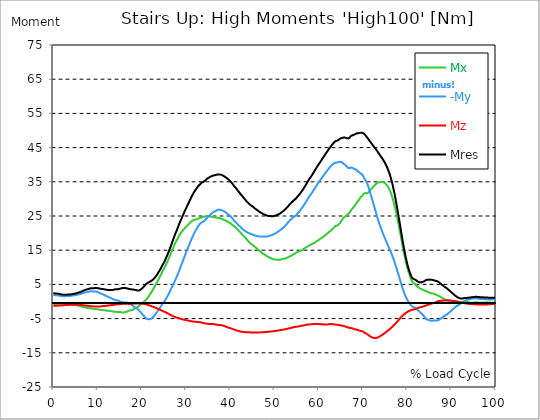
| Category |  Mx |  -My |  Mz |  Mres |
|---|---|---|---|---|
| 0.0 | -0.686 | 1.969 | -1.283 | 2.461 |
| 0.16678370786516855 | -0.686 | 1.898 | -1.283 | 2.408 |
| 0.3335674157303371 | -0.703 | 1.863 | -1.266 | 2.373 |
| 0.5003511235955057 | -0.703 | 1.846 | -1.248 | 2.355 |
| 0.6671348314606742 | -0.686 | 1.846 | -1.23 | 2.338 |
| 0.8339185393258427 | -0.703 | 1.811 | -1.213 | 2.303 |
| 1.0007022471910114 | -0.686 | 1.793 | -1.195 | 2.285 |
| 1.1674859550561796 | -0.65 | 1.775 | -1.178 | 2.25 |
| 1.3342696629213484 | -0.633 | 1.758 | -1.178 | 2.215 |
| 1.5010533707865168 | -0.615 | 1.705 | -1.16 | 2.18 |
| 1.6678370786516854 | -0.615 | 1.635 | -1.16 | 2.109 |
| 1.8346207865168538 | -0.633 | 1.564 | -1.143 | 2.057 |
| 2.001404494382023 | -0.65 | 1.529 | -1.107 | 2.021 |
| 2.1681882022471908 | -0.65 | 1.512 | -1.09 | 2.004 |
| 2.334971910112359 | -0.668 | 1.512 | -1.072 | 1.986 |
| 2.501755617977528 | -0.668 | 1.512 | -1.055 | 1.986 |
| 2.668539325842697 | -0.65 | 1.529 | -1.037 | 1.969 |
| 2.8353230337078656 | -0.615 | 1.547 | -1.02 | 1.969 |
| 3.0021067415730336 | -0.633 | 1.582 | -1.02 | 2.004 |
| 3.168890449438202 | -0.65 | 1.635 | -1.02 | 2.039 |
| 3.335674157303371 | -0.668 | 1.617 | -1.002 | 2.021 |
| 3.502457865168539 | -0.721 | 1.6 | -0.984 | 2.021 |
| 3.6692415730337076 | -0.756 | 1.582 | -0.967 | 2.021 |
| 3.8360252808988764 | -0.791 | 1.617 | -0.949 | 2.057 |
| 4.002808988764046 | -0.844 | 1.652 | -0.932 | 2.092 |
| 4.169592696629214 | -0.879 | 1.705 | -0.932 | 2.127 |
| 4.3363764044943816 | -0.896 | 1.74 | -0.914 | 2.162 |
| 4.50316011235955 | -0.914 | 1.775 | -0.914 | 2.215 |
| 4.669943820224718 | -0.932 | 1.828 | -0.932 | 2.25 |
| 4.836727528089888 | -0.967 | 1.846 | -0.949 | 2.303 |
| 5.003511235955056 | -1.002 | 1.881 | -0.949 | 2.338 |
| 5.170294943820225 | -1.055 | 1.916 | -0.949 | 2.391 |
| 5.337078651685394 | -1.125 | 1.951 | -0.949 | 2.443 |
| 5.5038623595505625 | -1.213 | 1.986 | -0.949 | 2.514 |
| 5.670646067415731 | -1.23 | 2.057 | -0.949 | 2.602 |
| 5.837429775280899 | -1.266 | 2.127 | -0.967 | 2.654 |
| 6.004213483146067 | -1.318 | 2.18 | -1.002 | 2.725 |
| 6.170997191011236 | -1.371 | 2.215 | -1.02 | 2.795 |
| 6.329002808988764 | -1.441 | 2.268 | -1.037 | 2.883 |
| 6.495786516853932 | -1.529 | 2.338 | -1.055 | 2.988 |
| 6.662570224719101 | -1.582 | 2.426 | -1.072 | 3.094 |
| 6.82935393258427 | -1.635 | 2.514 | -1.09 | 3.199 |
| 6.9961376404494375 | -1.67 | 2.602 | -1.125 | 3.287 |
| 7.162921348314607 | -1.723 | 2.672 | -1.16 | 3.393 |
| 7.329705056179775 | -1.758 | 2.707 | -1.195 | 3.445 |
| 7.496488764044945 | -1.811 | 2.742 | -1.23 | 3.498 |
| 7.663272471910113 | -1.863 | 2.76 | -1.248 | 3.551 |
| 7.830056179775281 | -1.916 | 2.795 | -1.266 | 3.621 |
| 7.996839887640449 | -1.969 | 2.848 | -1.283 | 3.691 |
| 8.16362359550562 | -1.986 | 2.9 | -1.318 | 3.762 |
| 8.330407303370787 | -1.986 | 2.988 | -1.353 | 3.832 |
| 8.497191011235955 | -2.004 | 3.006 | -1.371 | 3.867 |
| 8.663974719101123 | -2.039 | 2.971 | -1.389 | 3.867 |
| 8.830758426966291 | -2.057 | 2.936 | -1.406 | 3.85 |
| 8.99754213483146 | -2.109 | 2.9 | -1.424 | 3.867 |
| 9.16432584269663 | -2.162 | 2.918 | -1.441 | 3.902 |
| 9.331109550561798 | -2.18 | 2.918 | -1.459 | 3.92 |
| 9.497893258426966 | -2.197 | 2.918 | -1.459 | 3.937 |
| 9.664676966292134 | -2.215 | 2.9 | -1.459 | 3.937 |
| 9.831460674157304 | -2.232 | 2.83 | -1.477 | 3.902 |
| 9.998244382022472 | -2.268 | 2.76 | -1.477 | 3.885 |
| 10.16502808988764 | -2.303 | 2.672 | -1.477 | 3.85 |
| 10.331811797752808 | -2.373 | 2.566 | -1.459 | 3.832 |
| 10.498595505617978 | -2.426 | 2.478 | -1.459 | 3.797 |
| 10.665379213483147 | -2.443 | 2.373 | -1.441 | 3.744 |
| 10.832162921348315 | -2.478 | 2.268 | -1.406 | 3.691 |
| 10.998946629213483 | -2.496 | 2.18 | -1.389 | 3.656 |
| 11.165730337078653 | -2.514 | 2.092 | -1.353 | 3.621 |
| 11.33251404494382 | -2.531 | 2.004 | -1.336 | 3.603 |
| 11.49929775280899 | -2.549 | 1.898 | -1.318 | 3.568 |
| 11.666081460674157 | -2.584 | 1.775 | -1.301 | 3.516 |
| 11.832865168539326 | -2.619 | 1.67 | -1.283 | 3.48 |
| 11.999648876404493 | -2.654 | 1.564 | -1.248 | 3.445 |
| 12.166432584269662 | -2.689 | 1.477 | -1.213 | 3.41 |
| 12.333216292134832 | -2.707 | 1.371 | -1.178 | 3.375 |
| 12.5 | -2.707 | 1.283 | -1.143 | 3.34 |
| 12.66678370786517 | -2.725 | 1.213 | -1.125 | 3.322 |
| 12.833567415730336 | -2.76 | 1.125 | -1.09 | 3.322 |
| 13.000351123595506 | -2.812 | 1.02 | -1.072 | 3.34 |
| 13.167134831460674 | -2.865 | 0.896 | -1.055 | 3.34 |
| 13.333918539325843 | -2.9 | 0.791 | -1.02 | 3.357 |
| 13.500702247191011 | -2.936 | 0.686 | -0.984 | 3.375 |
| 13.667485955056181 | -2.971 | 0.58 | -0.932 | 3.445 |
| 13.834269662921349 | -3.006 | 0.51 | -0.914 | 3.516 |
| 14.001053370786519 | -3.023 | 0.439 | -0.879 | 3.551 |
| 14.167837078651687 | -3.023 | 0.369 | -0.861 | 3.568 |
| 14.334620786516853 | -3.041 | 0.352 | -0.844 | 3.603 |
| 14.501404494382026 | -3.041 | 0.316 | -0.844 | 3.621 |
| 14.668188202247192 | -3.041 | 0.246 | -0.826 | 3.621 |
| 14.834971910112362 | -3.041 | 0.141 | -0.791 | 3.674 |
| 15.001755617977528 | -3.059 | 0.053 | -0.773 | 3.727 |
| 15.168539325842698 | -3.094 | -0.035 | -0.756 | 3.779 |
| 15.335323033707864 | -3.146 | -0.105 | -0.738 | 3.85 |
| 15.502106741573034 | -3.182 | -0.176 | -0.703 | 3.902 |
| 15.6688904494382 | -3.217 | -0.246 | -0.686 | 3.937 |
| 15.83567415730337 | -3.199 | -0.264 | -0.686 | 3.937 |
| 16.00245786516854 | -3.182 | -0.264 | -0.668 | 3.955 |
| 16.16924157303371 | -3.164 | -0.264 | -0.668 | 3.973 |
| 16.336025280898877 | -3.094 | -0.281 | -0.686 | 3.937 |
| 16.502808988764045 | -3.023 | -0.299 | -0.686 | 3.885 |
| 16.669592696629216 | -2.936 | -0.334 | -0.686 | 3.832 |
| 16.83637640449438 | -2.83 | -0.369 | -0.703 | 3.762 |
| 17.003160112359552 | -2.742 | -0.422 | -0.703 | 3.709 |
| 17.169943820224717 | -2.672 | -0.527 | -0.703 | 3.656 |
| 17.336727528089888 | -2.619 | -0.668 | -0.686 | 3.603 |
| 17.503511235955056 | -2.584 | -0.826 | -0.668 | 3.586 |
| 17.670294943820224 | -2.514 | -0.967 | -0.668 | 3.551 |
| 17.837078651685395 | -2.443 | -1.107 | -0.65 | 3.533 |
| 18.003862359550563 | -2.373 | -1.266 | -0.633 | 3.516 |
| 18.17064606741573 | -2.268 | -1.459 | -0.615 | 3.48 |
| 18.3374297752809 | -2.145 | -1.635 | -0.598 | 3.445 |
| 18.504213483146067 | -2.021 | -1.775 | -0.598 | 3.445 |
| 18.662219101123597 | -1.916 | -1.846 | -0.598 | 3.34 |
| 18.829002808988765 | -1.793 | -1.969 | -0.598 | 3.234 |
| 18.995786516853933 | -1.652 | -2.127 | -0.598 | 3.199 |
| 19.1625702247191 | -1.477 | -2.32 | -0.58 | 3.164 |
| 19.32935393258427 | -1.318 | -2.549 | -0.58 | 3.199 |
| 19.49613764044944 | -1.178 | -2.83 | -0.58 | 3.305 |
| 19.662921348314608 | -1.002 | -3.041 | -0.58 | 3.41 |
| 19.829705056179776 | -0.826 | -3.305 | -0.598 | 3.586 |
| 19.996488764044944 | -0.65 | -3.533 | -0.615 | 3.744 |
| 20.163272471910112 | -0.475 | -3.762 | -0.633 | 3.92 |
| 20.33005617977528 | -0.281 | -4.043 | -0.668 | 4.166 |
| 20.49683988764045 | -0.07 | -4.289 | -0.703 | 4.412 |
| 20.663623595505616 | 0.158 | -4.535 | -0.756 | 4.676 |
| 20.830407303370787 | 0.369 | -4.764 | -0.791 | 4.904 |
| 20.997191011235955 | 0.598 | -4.957 | -0.844 | 5.133 |
| 21.163974719101123 | 0.861 | -5.062 | -0.914 | 5.273 |
| 21.330758426966295 | 1.125 | -5.15 | -0.967 | 5.432 |
| 21.497542134831463 | 1.406 | -5.203 | -1.037 | 5.555 |
| 21.66432584269663 | 1.723 | -5.203 | -1.107 | 5.678 |
| 21.8311095505618 | 2.057 | -5.15 | -1.178 | 5.801 |
| 21.997893258426966 | 2.373 | -5.08 | -1.266 | 5.906 |
| 22.164676966292134 | 2.707 | -4.992 | -1.353 | 6.029 |
| 22.331460674157306 | 3.059 | -4.816 | -1.441 | 6.205 |
| 22.498244382022467 | 3.445 | -4.588 | -1.529 | 6.398 |
| 22.66502808988764 | 3.832 | -4.377 | -1.6 | 6.609 |
| 22.831811797752806 | 4.236 | -4.131 | -1.687 | 6.838 |
| 22.99859550561798 | 4.623 | -3.867 | -1.775 | 7.084 |
| 23.165379213483146 | 5.027 | -3.586 | -1.863 | 7.348 |
| 23.332162921348313 | 5.432 | -3.269 | -1.951 | 7.646 |
| 23.49894662921348 | 5.801 | -2.971 | -2.039 | 7.98 |
| 23.665730337078653 | 6.152 | -2.637 | -2.127 | 8.332 |
| 23.83251404494382 | 6.574 | -2.303 | -2.232 | 8.701 |
| 23.999297752808985 | 7.014 | -2.021 | -2.338 | 9.017 |
| 24.166081460674157 | 7.471 | -1.723 | -2.443 | 9.369 |
| 24.332865168539325 | 7.91 | -1.389 | -2.549 | 9.773 |
| 24.499648876404496 | 8.35 | -1.037 | -2.637 | 10.178 |
| 24.666432584269664 | 8.789 | -0.686 | -2.742 | 10.617 |
| 24.833216292134832 | 9.176 | -0.404 | -2.83 | 11.004 |
| 25.0 | 9.527 | -0.158 | -2.936 | 11.373 |
| 25.16678370786517 | 9.949 | 0.158 | -3.023 | 11.812 |
| 25.33356741573034 | 10.389 | 0.51 | -3.129 | 12.287 |
| 25.500351123595504 | 10.846 | 0.861 | -3.234 | 12.762 |
| 25.66713483146067 | 11.32 | 1.248 | -3.34 | 13.254 |
| 25.833918539325843 | 11.795 | 1.635 | -3.445 | 13.781 |
| 26.00070224719101 | 12.305 | 2.039 | -3.568 | 14.308 |
| 26.16748595505618 | 12.814 | 2.461 | -3.674 | 14.853 |
| 26.334269662921347 | 13.324 | 2.9 | -3.797 | 15.416 |
| 26.50105337078652 | 13.869 | 3.34 | -3.92 | 16.013 |
| 26.667837078651687 | 14.414 | 3.814 | -4.043 | 16.611 |
| 26.834620786516858 | 14.959 | 4.254 | -4.166 | 17.209 |
| 27.001404494382022 | 15.451 | 4.728 | -4.254 | 17.806 |
| 27.16818820224719 | 15.961 | 5.203 | -4.359 | 18.404 |
| 27.334971910112362 | 16.453 | 5.66 | -4.465 | 19.002 |
| 27.50175561797753 | 16.945 | 6.117 | -4.553 | 19.582 |
| 27.668539325842698 | 17.349 | 6.592 | -4.623 | 20.092 |
| 27.835323033707866 | 17.719 | 7.049 | -4.676 | 20.584 |
| 28.002106741573037 | 18.123 | 7.576 | -4.746 | 21.129 |
| 28.168890449438205 | 18.545 | 8.086 | -4.816 | 21.691 |
| 28.335674157303373 | 18.967 | 8.613 | -4.904 | 22.271 |
| 28.502457865168537 | 19.371 | 9.211 | -4.957 | 22.834 |
| 28.669241573033705 | 19.74 | 9.791 | -5.027 | 23.343 |
| 28.836025280898877 | 20.039 | 10.353 | -5.08 | 23.818 |
| 29.002808988764052 | 20.338 | 10.898 | -5.133 | 24.328 |
| 29.169592696629213 | 20.619 | 11.461 | -5.185 | 24.802 |
| 29.336376404494384 | 20.883 | 12.041 | -5.238 | 25.295 |
| 29.50316011235955 | 21.164 | 12.603 | -5.291 | 25.84 |
| 29.669943820224724 | 21.41 | 13.183 | -5.361 | 26.332 |
| 29.836727528089884 | 21.638 | 13.763 | -5.414 | 26.771 |
| 30.003511235955056 | 21.867 | 14.326 | -5.449 | 27.228 |
| 30.170294943820224 | 22.095 | 14.853 | -5.502 | 27.685 |
| 30.337078651685395 | 22.306 | 15.363 | -5.555 | 28.16 |
| 30.503862359550563 | 22.535 | 15.908 | -5.59 | 28.599 |
| 30.670646067415728 | 22.746 | 16.435 | -5.625 | 29.039 |
| 30.837429775280903 | 22.957 | 16.98 | -5.678 | 29.513 |
| 30.99543539325843 | 23.15 | 17.49 | -5.713 | 29.97 |
| 31.162219101123597 | 23.343 | 18.017 | -5.766 | 30.445 |
| 31.32900280898876 | 23.519 | 18.51 | -5.801 | 30.867 |
| 31.495786516853936 | 23.66 | 18.967 | -5.836 | 31.254 |
| 31.6625702247191 | 23.783 | 19.459 | -5.871 | 31.658 |
| 31.82935393258427 | 23.871 | 19.951 | -5.906 | 32.027 |
| 31.996137640449433 | 23.941 | 20.39 | -5.924 | 32.378 |
| 32.162921348314605 | 24.011 | 20.742 | -5.924 | 32.677 |
| 32.329705056179776 | 24.064 | 21.129 | -5.941 | 32.976 |
| 32.49648876404494 | 24.117 | 21.533 | -5.959 | 33.293 |
| 32.66327247191011 | 24.187 | 21.902 | -5.976 | 33.574 |
| 32.83005617977528 | 24.275 | 22.183 | -6.012 | 33.837 |
| 32.996839887640455 | 24.345 | 22.5 | -6.029 | 34.066 |
| 33.16362359550562 | 24.398 | 22.728 | -6.064 | 34.259 |
| 33.330407303370784 | 24.486 | 22.974 | -6.1 | 34.488 |
| 33.497191011235955 | 24.591 | 23.185 | -6.152 | 34.716 |
| 33.66397471910113 | 24.662 | 23.22 | -6.223 | 34.804 |
| 33.83075842696629 | 24.75 | 23.273 | -6.293 | 34.91 |
| 33.997542134831455 | 24.802 | 23.431 | -6.328 | 35.085 |
| 34.164325842696634 | 24.802 | 23.59 | -6.363 | 35.191 |
| 34.3311095505618 | 24.855 | 23.818 | -6.398 | 35.367 |
| 34.49789325842697 | 24.908 | 24.064 | -6.434 | 35.578 |
| 34.66467696629213 | 24.925 | 24.345 | -6.469 | 35.789 |
| 34.831460674157306 | 24.908 | 24.644 | -6.486 | 35.982 |
| 34.99824438202247 | 24.908 | 24.732 | -6.539 | 36.052 |
| 35.16502808988764 | 24.908 | 24.961 | -6.557 | 36.21 |
| 35.331811797752806 | 24.89 | 25.101 | -6.574 | 36.298 |
| 35.49859550561798 | 24.838 | 25.382 | -6.539 | 36.457 |
| 35.66537921348315 | 24.802 | 25.593 | -6.539 | 36.58 |
| 35.83216292134831 | 24.75 | 25.787 | -6.557 | 36.685 |
| 35.998946629213485 | 24.732 | 25.892 | -6.574 | 36.738 |
| 36.16573033707865 | 24.679 | 26.156 | -6.592 | 36.843 |
| 36.33251404494382 | 24.644 | 26.244 | -6.644 | 36.878 |
| 36.499297752808985 | 24.627 | 26.332 | -6.697 | 36.914 |
| 36.666081460674164 | 24.609 | 26.437 | -6.732 | 36.966 |
| 36.83286516853932 | 24.556 | 26.56 | -6.75 | 37.037 |
| 36.99964887640449 | 24.468 | 26.718 | -6.785 | 37.107 |
| 37.166432584269664 | 24.468 | 26.789 | -6.803 | 37.16 |
| 37.333216292134836 | 24.433 | 26.824 | -6.838 | 37.177 |
| 37.5 | 24.381 | 26.824 | -6.838 | 37.16 |
| 37.666783707865164 | 24.328 | 26.841 | -6.855 | 37.16 |
| 37.833567415730336 | 24.275 | 26.789 | -6.891 | 37.107 |
| 38.00035112359551 | 24.205 | 26.736 | -6.943 | 37.037 |
| 38.16713483146068 | 24.134 | 26.631 | -6.978 | 36.931 |
| 38.333918539325836 | 24.029 | 26.543 | -7.031 | 36.826 |
| 38.50070224719101 | 23.906 | 26.455 | -7.101 | 36.703 |
| 38.66748595505618 | 23.8 | 26.297 | -7.172 | 36.544 |
| 38.83426966292135 | 23.695 | 26.156 | -7.26 | 36.386 |
| 39.001053370786515 | 23.625 | 25.998 | -7.348 | 36.263 |
| 39.16783707865169 | 23.554 | 25.857 | -7.435 | 36.158 |
| 39.33462078651686 | 23.431 | 25.681 | -7.541 | 35.964 |
| 39.50140449438202 | 23.308 | 25.506 | -7.611 | 35.771 |
| 39.668188202247194 | 23.168 | 25.33 | -7.664 | 35.578 |
| 39.83497191011236 | 23.009 | 25.172 | -7.734 | 35.367 |
| 40.00175561797753 | 22.851 | 25.013 | -7.805 | 35.173 |
| 40.168539325842694 | 22.693 | 24.82 | -7.857 | 34.945 |
| 40.335323033707866 | 22.57 | 24.556 | -7.945 | 34.699 |
| 40.50210674157304 | 22.412 | 24.275 | -8.033 | 34.418 |
| 40.6688904494382 | 22.218 | 23.994 | -8.103 | 34.119 |
| 40.83567415730337 | 22.025 | 23.713 | -8.174 | 33.802 |
| 41.00245786516854 | 21.849 | 23.484 | -8.262 | 33.556 |
| 41.16924157303371 | 21.709 | 23.291 | -8.332 | 33.345 |
| 41.33602528089887 | 21.533 | 23.062 | -8.42 | 33.082 |
| 41.502808988764045 | 21.304 | 22.834 | -8.49 | 32.8 |
| 41.669592696629216 | 21.076 | 22.552 | -8.543 | 32.484 |
| 41.83637640449439 | 20.847 | 22.324 | -8.613 | 32.203 |
| 42.00316011235955 | 20.601 | 22.131 | -8.666 | 31.939 |
| 42.16994382022472 | 20.373 | 21.955 | -8.701 | 31.675 |
| 42.33672752808989 | 20.127 | 21.779 | -8.754 | 31.412 |
| 42.50351123595506 | 19.898 | 21.568 | -8.807 | 31.148 |
| 42.670294943820224 | 19.67 | 21.357 | -8.842 | 30.884 |
| 42.83707865168539 | 19.459 | 21.111 | -8.894 | 30.603 |
| 43.00386235955057 | 19.195 | 20.988 | -8.93 | 30.357 |
| 43.17064606741573 | 18.949 | 20.795 | -8.947 | 30.093 |
| 43.32865168539326 | 18.72 | 20.619 | -8.965 | 29.83 |
| 43.495435393258425 | 18.474 | 20.478 | -8.982 | 29.584 |
| 43.6622191011236 | 18.228 | 20.302 | -9 | 29.32 |
| 43.82900280898876 | 17.982 | 20.197 | -9 | 29.091 |
| 43.99578651685393 | 17.736 | 20.092 | -9.017 | 28.88 |
| 44.162570224719104 | 17.508 | 20.004 | -9.017 | 28.652 |
| 44.32935393258427 | 17.261 | 19.916 | -9.017 | 28.459 |
| 44.49613764044944 | 17.051 | 19.845 | -9.035 | 28.265 |
| 44.66292134831461 | 16.857 | 19.81 | -9.035 | 28.125 |
| 44.82970505617978 | 16.752 | 19.705 | -9.053 | 27.984 |
| 44.99648876404493 | 16.611 | 19.635 | -9.053 | 27.843 |
| 45.16327247191011 | 16.435 | 19.529 | -9.053 | 27.668 |
| 45.33005617977528 | 16.242 | 19.441 | -9.07 | 27.474 |
| 45.49683988764045 | 16.066 | 19.336 | -9.07 | 27.298 |
| 45.66362359550561 | 15.873 | 19.265 | -9.088 | 27.123 |
| 45.83040730337079 | 15.679 | 19.195 | -9.088 | 26.964 |
| 45.99719101123596 | 15.486 | 19.16 | -9.088 | 26.806 |
| 46.16397471910113 | 15.275 | 19.107 | -9.088 | 26.631 |
| 46.33075842696629 | 15.082 | 19.09 | -9.07 | 26.472 |
| 46.497542134831455 | 14.906 | 19.037 | -9.07 | 26.314 |
| 46.66432584269663 | 14.713 | 19.002 | -9.053 | 26.173 |
| 46.83110955056179 | 14.537 | 18.984 | -9.035 | 26.05 |
| 46.99789325842696 | 14.361 | 19.002 | -9.017 | 25.91 |
| 47.164676966292134 | 14.203 | 18.984 | -9 | 25.787 |
| 47.331460674157306 | 14.045 | 18.984 | -8.982 | 25.664 |
| 47.49824438202247 | 13.904 | 18.984 | -8.982 | 25.558 |
| 47.66502808988764 | 13.763 | 18.984 | -8.965 | 25.453 |
| 47.83181179775281 | 13.64 | 18.984 | -8.947 | 25.347 |
| 47.99859550561797 | 13.482 | 19.002 | -8.93 | 25.259 |
| 48.16537921348314 | 13.342 | 19.037 | -8.912 | 25.172 |
| 48.33216292134831 | 13.219 | 19.037 | -8.894 | 25.101 |
| 48.498946629213485 | 13.113 | 19.037 | -8.877 | 25.013 |
| 48.66573033707865 | 13.008 | 19.09 | -8.859 | 24.978 |
| 48.83251404494382 | 12.92 | 19.16 | -8.824 | 24.978 |
| 48.99929775280899 | 12.797 | 19.283 | -8.771 | 24.978 |
| 49.166081460674164 | 12.691 | 19.353 | -8.754 | 24.943 |
| 49.33286516853933 | 12.533 | 19.459 | -8.736 | 24.925 |
| 49.499648876404486 | 12.428 | 19.511 | -8.719 | 24.908 |
| 49.666432584269664 | 12.392 | 19.599 | -8.701 | 24.943 |
| 49.83321629213483 | 12.34 | 19.705 | -8.683 | 24.996 |
| 50.0 | 12.305 | 19.793 | -8.648 | 25.049 |
| 50.166783707865164 | 12.287 | 19.898 | -8.631 | 25.101 |
| 50.33356741573034 | 12.269 | 20.004 | -8.596 | 25.154 |
| 50.50035112359551 | 12.234 | 20.144 | -8.578 | 25.242 |
| 50.66713483146068 | 12.199 | 20.302 | -8.525 | 25.347 |
| 50.83391853932584 | 12.199 | 20.443 | -8.49 | 25.435 |
| 51.00070224719101 | 12.199 | 20.601 | -8.437 | 25.558 |
| 51.16748595505618 | 12.234 | 20.742 | -8.402 | 25.681 |
| 51.33426966292134 | 12.287 | 20.883 | -8.367 | 25.804 |
| 51.50105337078652 | 12.34 | 21.076 | -8.332 | 25.98 |
| 51.66783707865169 | 12.375 | 21.252 | -8.297 | 26.138 |
| 51.83462078651686 | 12.41 | 21.445 | -8.262 | 26.297 |
| 52.00140449438202 | 12.48 | 21.603 | -8.226 | 26.437 |
| 52.168188202247194 | 12.533 | 21.761 | -8.174 | 26.595 |
| 52.33497191011236 | 12.586 | 22.025 | -8.139 | 26.824 |
| 52.50175561797752 | 12.621 | 22.306 | -8.086 | 27.052 |
| 52.668539325842694 | 12.691 | 22.517 | -8.033 | 27.263 |
| 52.835323033707866 | 12.797 | 22.711 | -7.998 | 27.474 |
| 53.00210674157304 | 12.902 | 22.992 | -7.945 | 27.738 |
| 53.1688904494382 | 12.99 | 23.291 | -7.892 | 28.019 |
| 53.33567415730337 | 13.096 | 23.554 | -7.84 | 28.265 |
| 53.502457865168545 | 13.183 | 23.765 | -7.805 | 28.494 |
| 53.669241573033716 | 13.289 | 23.959 | -7.752 | 28.705 |
| 53.83602528089887 | 13.43 | 24.117 | -7.699 | 28.898 |
| 54.002808988764045 | 13.57 | 24.31 | -7.611 | 29.109 |
| 54.169592696629216 | 13.711 | 24.521 | -7.523 | 29.338 |
| 54.33637640449438 | 13.834 | 24.732 | -7.506 | 29.566 |
| 54.50316011235955 | 13.939 | 24.873 | -7.453 | 29.742 |
| 54.669943820224724 | 14.08 | 24.996 | -7.418 | 29.9 |
| 54.836727528089895 | 14.203 | 25.172 | -7.383 | 30.111 |
| 55.00351123595506 | 14.344 | 25.365 | -7.365 | 30.339 |
| 55.17029494382022 | 14.449 | 25.646 | -7.348 | 30.638 |
| 55.337078651685395 | 14.537 | 25.892 | -7.312 | 30.884 |
| 55.50386235955056 | 14.625 | 26.138 | -7.277 | 31.113 |
| 55.66186797752809 | 14.695 | 26.402 | -7.225 | 31.377 |
| 55.82865168539326 | 14.783 | 26.701 | -7.172 | 31.658 |
| 55.995435393258425 | 14.888 | 27 | -7.119 | 31.939 |
| 56.1622191011236 | 15.012 | 27.281 | -7.084 | 32.238 |
| 56.32900280898877 | 15.135 | 27.545 | -7.049 | 32.519 |
| 56.49578651685393 | 15.293 | 27.879 | -7.014 | 32.853 |
| 56.6625702247191 | 15.433 | 28.213 | -6.978 | 33.222 |
| 56.82935393258427 | 15.574 | 28.547 | -6.926 | 33.574 |
| 56.99613764044943 | 15.732 | 28.88 | -6.855 | 33.925 |
| 57.16292134831461 | 15.873 | 29.214 | -6.82 | 34.277 |
| 57.329705056179776 | 15.978 | 29.566 | -6.767 | 34.628 |
| 57.49648876404495 | 16.101 | 29.97 | -6.75 | 35.033 |
| 57.66327247191011 | 16.207 | 30.339 | -6.732 | 35.419 |
| 57.83005617977529 | 16.312 | 30.638 | -6.732 | 35.718 |
| 57.99683988764044 | 16.453 | 30.937 | -6.715 | 36.052 |
| 58.16362359550561 | 16.558 | 31.254 | -6.697 | 36.369 |
| 58.33040730337079 | 16.681 | 31.552 | -6.662 | 36.685 |
| 58.497191011235955 | 16.787 | 31.869 | -6.644 | 37.019 |
| 58.66397471910112 | 16.892 | 32.203 | -6.609 | 37.353 |
| 58.83075842696629 | 17.015 | 32.572 | -6.574 | 37.722 |
| 58.99754213483147 | 17.138 | 32.906 | -6.557 | 38.074 |
| 59.164325842696634 | 17.261 | 33.24 | -6.539 | 38.425 |
| 59.33110955056179 | 17.402 | 33.591 | -6.539 | 38.794 |
| 59.49789325842697 | 17.56 | 33.89 | -6.557 | 39.111 |
| 59.664676966292134 | 17.701 | 34.242 | -6.557 | 39.498 |
| 59.8314606741573 | 17.859 | 34.541 | -6.574 | 39.814 |
| 59.99824438202247 | 18 | 34.822 | -6.592 | 40.13 |
| 60.16502808988765 | 18.158 | 35.121 | -6.627 | 40.447 |
| 60.33181179775281 | 18.316 | 35.437 | -6.644 | 40.781 |
| 60.49859550561798 | 18.474 | 35.753 | -6.662 | 41.115 |
| 60.66537921348315 | 18.615 | 36.052 | -6.68 | 41.449 |
| 60.83216292134831 | 18.738 | 36.404 | -6.68 | 41.783 |
| 60.99894662921348 | 18.879 | 36.703 | -6.68 | 42.099 |
| 61.16573033707864 | 19.037 | 36.984 | -6.697 | 42.415 |
| 61.33251404494383 | 19.213 | 37.283 | -6.715 | 42.749 |
| 61.49929775280899 | 19.406 | 37.564 | -6.715 | 43.083 |
| 61.66608146067416 | 19.582 | 37.828 | -6.732 | 43.4 |
| 61.83286516853932 | 19.775 | 38.074 | -6.75 | 43.699 |
| 61.99964887640451 | 19.951 | 38.373 | -6.732 | 43.997 |
| 62.16643258426967 | 20.109 | 38.689 | -6.68 | 44.331 |
| 62.33321629213482 | 20.302 | 38.988 | -6.627 | 44.648 |
| 62.5 | 20.478 | 39.251 | -6.609 | 44.947 |
| 62.66678370786517 | 20.636 | 39.498 | -6.592 | 45.228 |
| 62.833567415730336 | 20.83 | 39.726 | -6.609 | 45.509 |
| 63.0003511235955 | 21.058 | 39.937 | -6.627 | 45.808 |
| 63.16713483146068 | 21.304 | 40.113 | -6.68 | 46.089 |
| 63.33391853932585 | 21.48 | 40.253 | -6.68 | 46.3 |
| 63.500702247191015 | 21.726 | 40.412 | -6.697 | 46.564 |
| 63.66748595505618 | 21.955 | 40.535 | -6.715 | 46.757 |
| 63.83426966292135 | 22.148 | 40.605 | -6.732 | 46.933 |
| 64.00105337078651 | 22.201 | 40.64 | -6.767 | 47.003 |
| 64.16783707865169 | 22.218 | 40.658 | -6.785 | 47.021 |
| 64.33462078651687 | 22.289 | 40.693 | -6.82 | 47.091 |
| 64.50140449438203 | 22.482 | 40.728 | -6.873 | 47.232 |
| 64.6681882022472 | 22.763 | 40.798 | -6.908 | 47.443 |
| 64.83497191011236 | 23.027 | 40.851 | -6.943 | 47.619 |
| 65.00175561797754 | 23.291 | 40.869 | -6.996 | 47.759 |
| 65.16853932584269 | 23.677 | 40.728 | -7.014 | 47.829 |
| 65.33532303370787 | 24.011 | 40.552 | -7.066 | 47.865 |
| 65.50210674157304 | 24.275 | 40.376 | -7.119 | 47.865 |
| 65.66889044943821 | 24.556 | 40.253 | -7.172 | 47.935 |
| 65.83567415730337 | 24.767 | 40.148 | -7.225 | 47.988 |
| 66.00245786516854 | 24.873 | 39.972 | -7.295 | 47.917 |
| 66.1692415730337 | 24.996 | 39.779 | -7.365 | 47.847 |
| 66.33602528089888 | 25.172 | 39.515 | -7.453 | 47.759 |
| 66.50280898876404 | 25.435 | 39.269 | -7.523 | 47.724 |
| 66.66959269662921 | 25.664 | 39.005 | -7.594 | 47.671 |
| 66.83637640449439 | 25.892 | 38.97 | -7.664 | 47.794 |
| 67.00316011235955 | 26.086 | 39.023 | -7.717 | 47.935 |
| 67.16994382022472 | 26.42 | 39.111 | -7.752 | 48.199 |
| 67.33672752808988 | 26.771 | 39.181 | -7.769 | 48.462 |
| 67.50351123595506 | 27.017 | 39.164 | -7.822 | 48.585 |
| 67.67029494382022 | 27.246 | 39.005 | -7.875 | 48.62 |
| 67.83707865168539 | 27.474 | 38.865 | -7.963 | 48.656 |
| 67.99508426966291 | 27.756 | 38.812 | -8.051 | 48.779 |
| 68.16186797752809 | 28.072 | 38.742 | -8.121 | 48.902 |
| 68.32865168539327 | 28.353 | 38.619 | -8.174 | 48.99 |
| 68.49543539325843 | 28.652 | 38.531 | -8.209 | 49.077 |
| 68.6622191011236 | 28.986 | 38.39 | -8.244 | 49.183 |
| 68.82900280898876 | 29.302 | 38.091 | -8.332 | 49.165 |
| 68.99578651685394 | 29.584 | 37.898 | -8.402 | 49.201 |
| 69.1625702247191 | 29.847 | 37.792 | -8.455 | 49.271 |
| 69.32935393258425 | 30.252 | 37.599 | -8.56 | 49.341 |
| 69.49613764044945 | 30.586 | 37.406 | -8.613 | 49.394 |
| 69.66292134831461 | 30.726 | 37.265 | -8.631 | 49.376 |
| 69.82970505617978 | 30.867 | 37.125 | -8.666 | 49.341 |
| 69.99648876404494 | 31.166 | 36.773 | -8.807 | 49.253 |
| 70.16327247191012 | 31.517 | 36.351 | -8.982 | 49.13 |
| 70.33005617977528 | 31.693 | 35.964 | -9.105 | 48.972 |
| 70.49683988764045 | 31.728 | 35.613 | -9.228 | 48.744 |
| 70.66362359550561 | 31.623 | 35.279 | -9.316 | 48.445 |
| 70.83040730337079 | 31.605 | 34.839 | -9.439 | 48.146 |
| 70.99719101123596 | 31.675 | 34.347 | -9.58 | 47.865 |
| 71.16397471910112 | 31.834 | 33.785 | -9.738 | 47.583 |
| 71.3307584269663 | 32.062 | 33.117 | -9.896 | 47.302 |
| 71.49754213483146 | 32.343 | 32.361 | -10.09 | 46.968 |
| 71.66432584269663 | 32.607 | 31.623 | -10.265 | 46.669 |
| 71.83110955056179 | 32.836 | 30.92 | -10.371 | 46.388 |
| 71.99789325842697 | 33.082 | 30.234 | -10.459 | 46.124 |
| 72.16467696629215 | 33.293 | 29.443 | -10.564 | 45.79 |
| 72.3314606741573 | 33.556 | 28.722 | -10.617 | 45.527 |
| 72.49824438202248 | 33.785 | 27.984 | -10.652 | 45.263 |
| 72.66502808988764 | 34.013 | 27.228 | -10.67 | 44.964 |
| 72.8318117977528 | 34.224 | 26.455 | -10.67 | 44.665 |
| 72.99859550561797 | 34.435 | 25.716 | -10.652 | 44.384 |
| 73.16537921348315 | 34.611 | 24.978 | -10.599 | 44.103 |
| 73.33216292134833 | 34.769 | 24.275 | -10.529 | 43.804 |
| 73.49894662921349 | 34.822 | 23.59 | -10.424 | 43.453 |
| 73.66573033707864 | 34.857 | 22.922 | -10.318 | 43.101 |
| 73.83251404494382 | 34.91 | 22.271 | -10.195 | 42.785 |
| 73.99929775280899 | 34.945 | 21.674 | -10.055 | 42.486 |
| 74.16608146067415 | 34.98 | 21.093 | -9.932 | 42.205 |
| 74.33286516853933 | 34.998 | 20.513 | -9.791 | 41.906 |
| 74.49964887640449 | 34.962 | 19.986 | -9.633 | 41.624 |
| 74.66643258426967 | 34.857 | 19.424 | -9.492 | 41.255 |
| 74.83321629213484 | 34.734 | 18.896 | -9.334 | 40.851 |
| 75.0 | 34.558 | 18.369 | -9.176 | 40.464 |
| 75.16678370786516 | 34.365 | 17.877 | -9 | 40.042 |
| 75.33356741573033 | 34.119 | 17.349 | -8.842 | 39.585 |
| 75.5003511235955 | 33.855 | 16.84 | -8.683 | 39.093 |
| 75.66713483146067 | 33.521 | 16.33 | -8.508 | 38.566 |
| 75.83391853932585 | 33.134 | 15.838 | -8.314 | 38.003 |
| 76.00070224719101 | 32.712 | 15.363 | -8.139 | 37.406 |
| 76.16748595505618 | 32.203 | 14.871 | -7.945 | 36.738 |
| 76.33426966292136 | 31.623 | 14.379 | -7.752 | 35.982 |
| 76.50105337078652 | 31.007 | 13.834 | -7.576 | 35.173 |
| 76.66783707865167 | 30.322 | 13.271 | -7.365 | 34.312 |
| 76.83462078651685 | 29.566 | 12.691 | -7.154 | 33.38 |
| 77.00140449438202 | 28.74 | 12.058 | -6.926 | 32.378 |
| 77.1681882022472 | 27.914 | 11.408 | -6.715 | 31.341 |
| 77.33497191011236 | 26.982 | 10.758 | -6.486 | 30.216 |
| 77.50175561797754 | 25.998 | 10.055 | -6.24 | 29.039 |
| 77.6685393258427 | 24.996 | 9.387 | -5.994 | 27.843 |
| 77.83532303370787 | 23.976 | 8.683 | -5.766 | 26.631 |
| 78.00210674157303 | 22.904 | 7.998 | -5.519 | 25.365 |
| 78.1688904494382 | 21.814 | 7.312 | -5.256 | 24.099 |
| 78.33567415730337 | 20.707 | 6.539 | -5.01 | 22.781 |
| 78.50245786516854 | 19.564 | 5.801 | -4.781 | 21.445 |
| 78.66924157303372 | 18.404 | 5.115 | -4.535 | 20.127 |
| 78.83602528089888 | 17.261 | 4.412 | -4.324 | 18.808 |
| 79.00280898876404 | 16.119 | 3.691 | -4.096 | 17.508 |
| 79.16959269662921 | 15.012 | 3.076 | -3.902 | 16.277 |
| 79.33637640449439 | 13.922 | 2.496 | -3.709 | 15.099 |
| 79.50316011235955 | 12.902 | 1.951 | -3.533 | 14.01 |
| 79.66994382022472 | 11.918 | 1.441 | -3.375 | 12.972 |
| 79.8367275280899 | 10.969 | 0.967 | -3.217 | 11.971 |
| 80.00351123595506 | 10.072 | 0.527 | -3.076 | 11.056 |
| 80.17029494382022 | 9.281 | 0.141 | -2.936 | 10.23 |
| 80.32830056179776 | 8.578 | -0.141 | -2.83 | 9.527 |
| 80.49508426966293 | 7.91 | -0.422 | -2.725 | 8.877 |
| 80.66186797752809 | 7.26 | -0.756 | -2.637 | 8.226 |
| 80.82865168539325 | 6.662 | -1.072 | -2.549 | 7.646 |
| 80.99543539325842 | 6.17 | -1.301 | -2.461 | 7.207 |
| 81.1622191011236 | 5.766 | -1.512 | -2.408 | 6.855 |
| 81.32900280898878 | 5.467 | -1.635 | -2.373 | 6.627 |
| 81.49578651685394 | 5.326 | -1.687 | -2.355 | 6.557 |
| 81.6625702247191 | 5.221 | -1.74 | -2.285 | 6.504 |
| 81.82935393258427 | 5.045 | -1.863 | -2.18 | 6.381 |
| 81.99613764044945 | 4.781 | -2.057 | -2.092 | 6.187 |
| 82.16292134831461 | 4.535 | -2.232 | -2.004 | 6.047 |
| 82.32970505617978 | 4.359 | -2.408 | -1.916 | 5.906 |
| 82.49648876404494 | 4.201 | -2.619 | -1.863 | 5.766 |
| 82.66327247191012 | 4.043 | -2.848 | -1.793 | 5.695 |
| 82.83005617977528 | 3.885 | -3.076 | -1.723 | 5.643 |
| 82.99683988764045 | 3.709 | -3.287 | -1.652 | 5.59 |
| 83.16362359550563 | 3.586 | -3.463 | -1.617 | 5.59 |
| 83.33040730337079 | 3.533 | -3.656 | -1.564 | 5.678 |
| 83.49719101123596 | 3.428 | -3.867 | -1.512 | 5.748 |
| 83.66397471910112 | 3.322 | -4.078 | -1.459 | 5.766 |
| 83.8307584269663 | 3.199 | -4.359 | -1.389 | 5.871 |
| 83.99754213483146 | 3.129 | -4.676 | -1.283 | 6.047 |
| 84.16432584269663 | 3.059 | -4.975 | -1.195 | 6.223 |
| 84.33110955056179 | 2.988 | -5.168 | -1.125 | 6.31 |
| 84.49789325842697 | 2.9 | -5.273 | -1.037 | 6.363 |
| 84.66467696629213 | 2.777 | -5.344 | -0.967 | 6.363 |
| 84.8314606741573 | 2.707 | -5.396 | -0.896 | 6.363 |
| 84.99824438202248 | 2.619 | -5.502 | -0.826 | 6.398 |
| 85.16502808988764 | 2.549 | -5.59 | -0.756 | 6.416 |
| 85.3318117977528 | 2.496 | -5.607 | -0.686 | 6.398 |
| 85.49859550561797 | 2.443 | -5.607 | -0.65 | 6.346 |
| 85.66537921348315 | 2.391 | -5.625 | -0.562 | 6.328 |
| 85.83216292134831 | 2.32 | -5.607 | -0.492 | 6.293 |
| 85.99894662921348 | 2.268 | -5.572 | -0.457 | 6.205 |
| 86.16573033707866 | 2.18 | -5.537 | -0.369 | 6.135 |
| 86.33251404494384 | 2.092 | -5.519 | -0.299 | 6.064 |
| 86.499297752809 | 2.021 | -5.537 | -0.193 | 6.029 |
| 86.66608146067415 | 1.916 | -5.607 | -0.07 | 6.029 |
| 86.83286516853933 | 1.811 | -5.572 | 0.035 | 5.924 |
| 86.99964887640449 | 1.705 | -5.502 | 0.105 | 5.818 |
| 87.16643258426966 | 1.617 | -5.361 | 0.123 | 5.643 |
| 87.33321629213482 | 1.512 | -5.221 | 0.158 | 5.484 |
| 87.5 | 1.389 | -5.08 | 0.193 | 5.309 |
| 87.66678370786518 | 1.248 | -4.922 | 0.229 | 5.115 |
| 87.83356741573033 | 1.107 | -4.781 | 0.246 | 4.939 |
| 88.00035112359551 | 0.984 | -4.605 | 0.246 | 4.764 |
| 88.16713483146067 | 0.826 | -4.482 | 0.264 | 4.605 |
| 88.33391853932584 | 0.721 | -4.307 | 0.281 | 4.412 |
| 88.500702247191 | 0.58 | -4.184 | 0.299 | 4.271 |
| 88.66748595505618 | 0.475 | -4.06 | 0.334 | 4.131 |
| 88.83426966292136 | 0.369 | -3.92 | 0.352 | 3.99 |
| 89.00105337078652 | 0.299 | -3.762 | 0.369 | 3.814 |
| 89.16783707865169 | 0.211 | -3.603 | 0.369 | 3.656 |
| 89.33462078651687 | 0.141 | -3.428 | 0.369 | 3.48 |
| 89.50140449438203 | 0.088 | -3.234 | 0.352 | 3.269 |
| 89.6681882022472 | 0.07 | -3.041 | 0.316 | 3.094 |
| 89.83497191011236 | 0.07 | -2.848 | 0.281 | 2.883 |
| 90.00175561797754 | 0.105 | -2.654 | 0.246 | 2.689 |
| 90.16853932584269 | 0.123 | -2.443 | 0.211 | 2.478 |
| 90.33532303370787 | 0.141 | -2.25 | 0.176 | 2.285 |
| 90.50210674157303 | 0.158 | -2.057 | 0.123 | 2.109 |
| 90.6688904494382 | 0.158 | -1.881 | 0.07 | 1.934 |
| 90.83567415730336 | 0.158 | -1.687 | 0.018 | 1.74 |
| 91.00245786516854 | 0.158 | -1.512 | -0.035 | 1.547 |
| 91.1692415730337 | 0.141 | -1.353 | -0.07 | 1.406 |
| 91.33602528089888 | 0.07 | -1.23 | -0.123 | 1.283 |
| 91.50280898876404 | 0.018 | -1.107 | -0.158 | 1.16 |
| 91.66959269662922 | -0.07 | -0.984 | -0.193 | 1.072 |
| 91.83637640449439 | -0.141 | -0.861 | -0.211 | 1.002 |
| 92.00316011235955 | -0.193 | -0.721 | -0.246 | 0.932 |
| 92.16994382022472 | -0.211 | -0.562 | -0.281 | 0.844 |
| 92.3367275280899 | -0.246 | -0.387 | -0.316 | 0.826 |
| 92.50351123595506 | -0.264 | -0.193 | -0.369 | 0.879 |
| 92.66151685393258 | -0.246 | -0.053 | -0.404 | 0.932 |
| 92.82830056179776 | -0.211 | 0.088 | -0.457 | 0.984 |
| 92.99508426966291 | -0.193 | 0.193 | -0.492 | 1.037 |
| 93.16186797752809 | -0.176 | 0.299 | -0.545 | 1.02 |
| 93.32865168539325 | -0.158 | 0.404 | -0.58 | 1.037 |
| 93.49543539325842 | -0.176 | 0.457 | -0.615 | 1.055 |
| 93.66221910112358 | -0.176 | 0.527 | -0.65 | 1.055 |
| 93.82900280898876 | -0.229 | 0.562 | -0.686 | 1.107 |
| 93.99578651685393 | -0.264 | 0.615 | -0.703 | 1.143 |
| 94.1625702247191 | -0.299 | 0.668 | -0.721 | 1.16 |
| 94.32935393258427 | -0.334 | 0.721 | -0.738 | 1.178 |
| 94.49613764044945 | -0.369 | 0.756 | -0.738 | 1.213 |
| 94.66292134831461 | -0.404 | 0.809 | -0.756 | 1.266 |
| 94.82970505617978 | -0.387 | 0.861 | -0.756 | 1.283 |
| 94.99648876404494 | -0.334 | 0.914 | -0.773 | 1.318 |
| 95.16327247191012 | -0.299 | 0.949 | -0.791 | 1.336 |
| 95.33005617977528 | -0.281 | 0.967 | -0.809 | 1.353 |
| 95.49683988764046 | -0.246 | 0.984 | -0.826 | 1.371 |
| 95.66362359550563 | -0.246 | 0.967 | -0.844 | 1.371 |
| 95.83040730337078 | -0.264 | 0.914 | -0.861 | 1.353 |
| 95.99719101123594 | -0.281 | 0.879 | -0.861 | 1.336 |
| 96.16397471910112 | -0.334 | 0.826 | -0.861 | 1.301 |
| 96.33075842696628 | -0.369 | 0.773 | -0.861 | 1.283 |
| 96.49754213483145 | -0.369 | 0.756 | -0.861 | 1.266 |
| 96.66432584269663 | -0.352 | 0.756 | -0.861 | 1.248 |
| 96.8311095505618 | -0.334 | 0.738 | -0.861 | 1.23 |
| 96.99789325842697 | -0.316 | 0.721 | -0.861 | 1.23 |
| 97.16467696629213 | -0.299 | 0.721 | -0.879 | 1.213 |
| 97.3314606741573 | -0.316 | 0.686 | -0.879 | 1.213 |
| 97.49824438202248 | -0.299 | 0.686 | -0.879 | 1.195 |
| 97.66502808988764 | -0.299 | 0.668 | -0.879 | 1.195 |
| 97.8318117977528 | -0.299 | 0.633 | -0.861 | 1.16 |
| 97.99859550561798 | -0.281 | 0.633 | -0.861 | 1.143 |
| 98.16537921348316 | -0.299 | 0.615 | -0.844 | 1.143 |
| 98.33216292134833 | -0.299 | 0.615 | -0.826 | 1.125 |
| 98.49894662921349 | -0.281 | 0.615 | -0.826 | 1.107 |
| 98.66573033707866 | -0.316 | 0.598 | -0.809 | 1.107 |
| 98.8325140449438 | -0.334 | 0.598 | -0.791 | 1.107 |
| 98.99929775280897 | -0.369 | 0.598 | -0.773 | 1.107 |
| 99.16608146067416 | -0.369 | 0.633 | -0.756 | 1.107 |
| 99.33286516853933 | -0.387 | 0.65 | -0.738 | 1.107 |
| 99.49964887640449 | -0.387 | 0.668 | -0.721 | 1.107 |
| 99.66643258426966 | -0.369 | 0.668 | -0.721 | 1.09 |
| 99.83321629213484 | -0.352 | 0.65 | -0.686 | 1.072 |
| 100.0 | -0.352 | 0.668 | -0.686 | 1.072 |